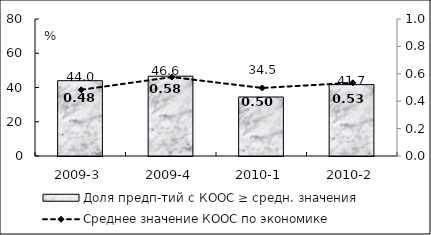
| Category | Доля предп-тий с КООС ≥ средн. значения  |
|---|---|
| 2009-3 | 43.97 |
| 2009-4 | 46.61 |
| 2010-1 | 34.45 |
| 2010-2 | 41.67 |